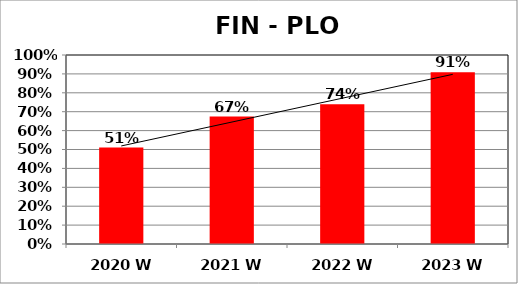
| Category | Series 0 |
|---|---|
| 2020 W | 0.51 |
| 2021 W | 0.674 |
| 2022 W | 0.74 |
| 2023 W | 0.909 |